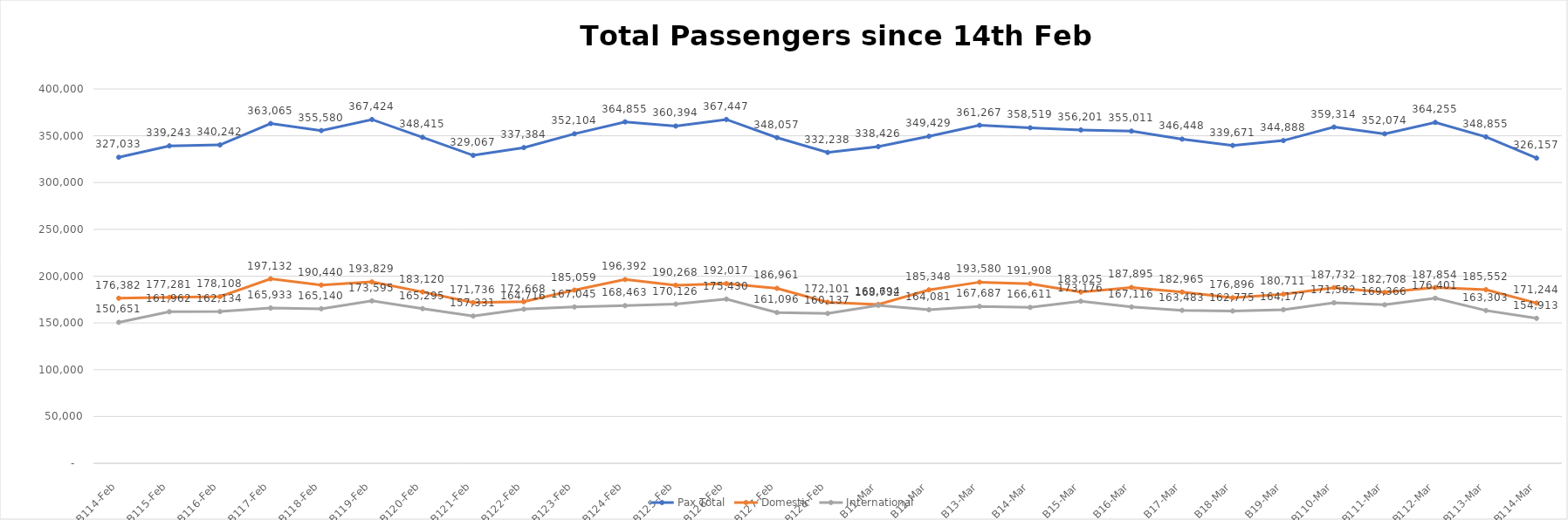
| Category | Pax Total |  Domestic  |  International  |
|---|---|---|---|
| 2023-02-14 | 327033 | 176382 | 150651 |
| 2023-02-15 | 339243 | 177281 | 161962 |
| 2023-02-16 | 340242 | 178108 | 162134 |
| 2023-02-17 | 363065 | 197132 | 165933 |
| 2023-02-18 | 355580 | 190440 | 165140 |
| 2023-02-19 | 367424 | 193829 | 173595 |
| 2023-02-20 | 348415 | 183120 | 165295 |
| 2023-02-21 | 329067 | 171736 | 157331 |
| 2023-02-22 | 337384 | 172668 | 164716 |
| 2023-02-23 | 352104 | 185059 | 167045 |
| 2023-02-24 | 364855 | 196392 | 168463 |
| 2023-02-25 | 360394 | 190268 | 170126 |
| 2023-02-26 | 367447 | 192017 | 175430 |
| 2023-02-27 | 348057 | 186961 | 161096 |
| 2023-02-28 | 332238 | 172101 | 160137 |
| 2023-03-01 | 338426 | 169694 | 168732 |
| 2023-03-02 | 349429 | 185348 | 164081 |
| 2023-03-03 | 361267 | 193580 | 167687 |
| 2023-03-04 | 358519 | 191908 | 166611 |
| 2023-03-05 | 356201 | 183025 | 173176 |
| 2023-03-06 | 355011 | 187895 | 167116 |
| 2023-03-07 | 346448 | 182965 | 163483 |
| 2023-03-08 | 339671 | 176896 | 162775 |
| 2023-03-09 | 344888 | 180711 | 164177 |
| 2023-03-10 | 359314 | 187732 | 171582 |
| 2023-03-11 | 352074 | 182708 | 169366 |
| 2023-03-12 | 364255 | 187854 | 176401 |
| 2023-03-13 | 348855 | 185552 | 163303 |
| 2023-03-14 | 326157 | 171244 | 154913 |